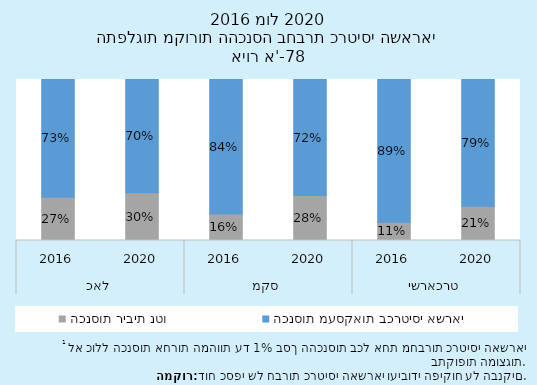
| Category | הכנסות ריבית נטו  | הכנסות מעסקאות בכרטיסי אשראי |
|---|---|---|
| 0 | 0.269 | 0.731 |
| 1 | 0.297 | 0.703 |
| 2 | 0.165 | 0.835 |
| 3 | 0.279 | 0.721 |
| 4 | 0.113 | 0.887 |
| 5 | 0.212 | 0.788 |